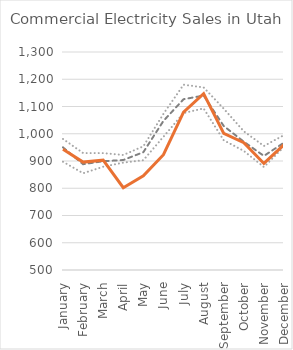
| Category | 5-year Max | 5-year Min | 5-year Avg | 2020 |
|---|---|---|---|---|
| January | 981 | 897 | 950 | 943 |
| February | 929 | 855 | 888.2 | 896 |
| March | 929 | 879 | 899.2 | 903 |
| April | 922 | 894 | 903.6 | 802 |
| May | 954 | 903 | 932.4 | 846 |
| June | 1073 | 989 | 1047.2 | 923 |
| July | 1180 | 1076 | 1126.6 | 1079 |
| August | 1170 | 1093 | 1140.2 | 1147 |
| September | 1092 | 976 | 1028.4 | 1001 |
| October | 1009 | 937 | 970.8 | 967 |
| November | 955 | 878 | 918.6 | 891 |
| December | 995 | 952 | 967.4 | 960 |